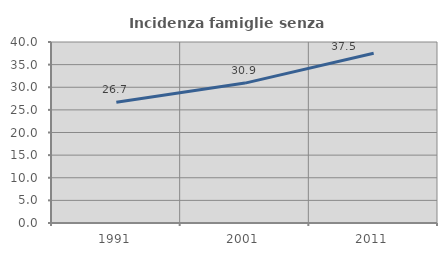
| Category | Incidenza famiglie senza nuclei |
|---|---|
| 1991.0 | 26.665 |
| 2001.0 | 30.916 |
| 2011.0 | 37.529 |